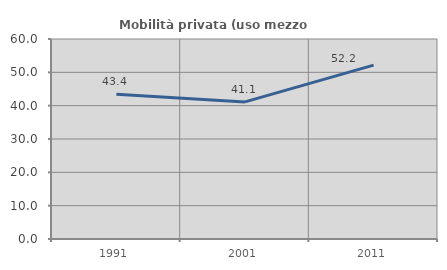
| Category | Mobilità privata (uso mezzo privato) |
|---|---|
| 1991.0 | 43.445 |
| 2001.0 | 41.121 |
| 2011.0 | 52.174 |